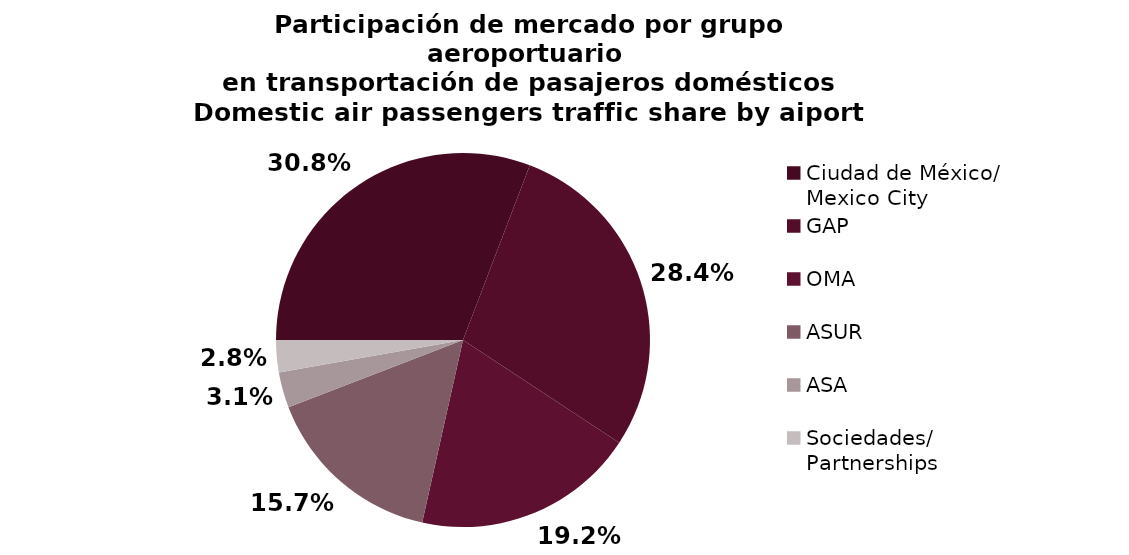
| Category | Series 0 |
|---|---|
| Ciudad de México/
Mexico City | 2888.679 |
| GAP | 2665.405 |
| OMA | 1804.111 |
| ASUR | 1466.844 |
| ASA | 287.466 |
| Sociedades/
Partnerships | 260.568 |